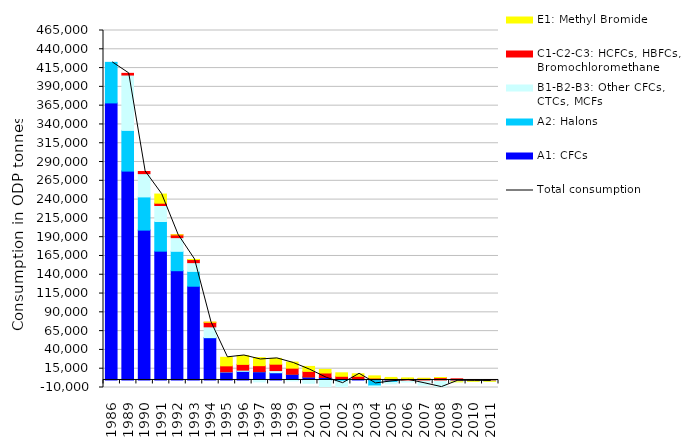
| Category | A1: CFCs | A2: Halons | B1-B2-B3: Other CFCs, CTCs, MCFs | C1-C2-C3: HCFCs, HBFCs, Bromochloromethane | E1: Methyl Bromide |
|---|---|---|---|---|---|
| 1986.0 | 368638.2 | 53982.2 | 0 | 0 | 0 |
| 1989.0 | 277941.5 | 54136.3 | 73669.8 | 2223.7 | 0 |
| 1990.0 | 199412.4 | 44168.4 | 30977.3 | 2847.6 | 0 |
| 1991.0 | 171410.8 | 39453.2 | 21307.2 | 3045.8 | 12169.5 |
| 1992.0 | 145404.2 | 25793.5 | 18208 | 3693.6 | 36.7 |
| 1993.0 | 124765.2 | 19700.3 | 11656.2 | 4140.5 | 116.7 |
| 1994.0 | 56174.8 | 290.9 | 14246.2 | 6040 | 198.8 |
| 1995.0 | 10687.9 | 176.2 | 5.1 | 7944.7 | 11356.6 |
| 1996.0 | 11460.2 | 230.3 | 1383.1 | 7688.3 | 11827.5 |
| 1997.0 | 10884.7 | 153.2 | -2477.2 | 8000.6 | 10724.8 |
| 1998.0 | 9575.5 | 236.5 | 2697.8 | 8503.9 | 7730.3 |
| 1999.0 | 7386.5 | 169 | -1184.3 | 8199.5 | 8060.2 |
| 2000.0 | 3806.4 | 140.5 | -4409.2 | 7492.1 | 6623.5 |
| 2001.0 | 3391.7 | -229.2 | -10853.2 | 5921.7 | 4765.5 |
| 2002.0 | 1064.4 | -1596 | -12206.4 | 3835.6 | 4664.3 |
| 2003.0 | 1221.3 | 27.9 | 364.1 | 3338.1 | 3290.1 |
| 2004.0 | 496.4 | -7833.8 | -2173.1 | 1995 | 2977.7 |
| 2005.0 | -890.4 | -2309.8 | -1952.5 | 1968.8 | 1436.1 |
| 2006.0 | -29 | -224.9 | -2495.3 | 1971.7 | 868.7 |
| 2007.0 | -170.9 | -196.7 | -6441.8 | 2038.8 | 212.2 |
| 2008.0 | -555.9 | 4.8 | -12214.8 | 3116.4 | 164.9 |
| 2009.0 | -1083.6 | -216.7 | -1122.4 | 1527 | -2.1 |
| 2010.0 | -870.9 | -85.1 | -710.1 | 578.8 | -63.1 |
| 2011.0 | -1122.7 | -252.9 | -327.5 | 397.56 | -6.5 |